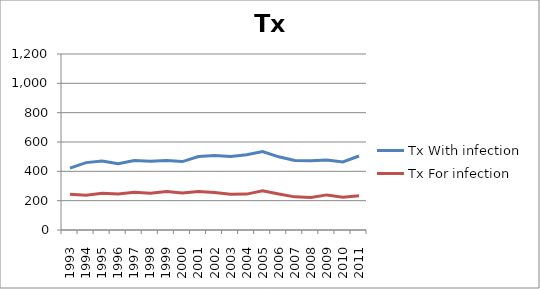
| Category | Tx With infection | Tx For infection |
|---|---|---|
| 1993 | 422.362 | 244.355 |
| 1994 | 459.357 | 236.738 |
| 1995 | 471.119 | 250.538 |
| 1996 | 452.523 | 245.942 |
| 1997 | 473.692 | 256.62 |
| 1998 | 468.066 | 249.993 |
| 1999 | 473.532 | 263.064 |
| 2000 | 466.459 | 251.485 |
| 2001 | 500.735 | 261.723 |
| 2002 | 507.226 | 256.262 |
| 2003 | 500.934 | 244.477 |
| 2004 | 513.513 | 244.747 |
| 2005 | 535.141 | 267.04 |
| 2006 | 498.863 | 245.601 |
| 2007 | 473.865 | 225.935 |
| 2008 | 472.698 | 220.954 |
| 2009 | 476.921 | 239.36 |
| 2010 | 464.073 | 223.244 |
| 2011 | 504.554 | 233.024 |